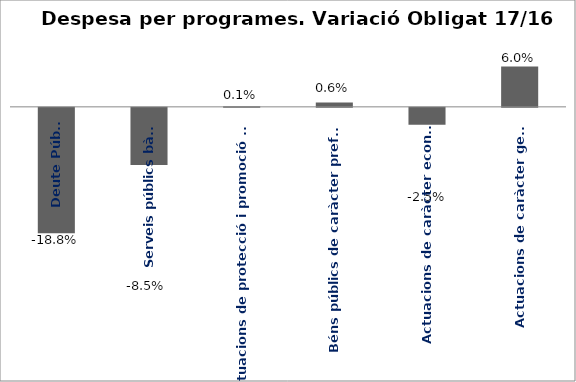
| Category | Series 0 |
|---|---|
| Deute Públic | -0.188 |
| Serveis públics bàsics | -0.085 |
| Actuacions de protecció i promoció social | 0.001 |
| Béns públics de caràcter preferent | 0.006 |
| Actuacions de caràcter econòmic | -0.025 |
| Actuacions de caràcter general | 0.06 |